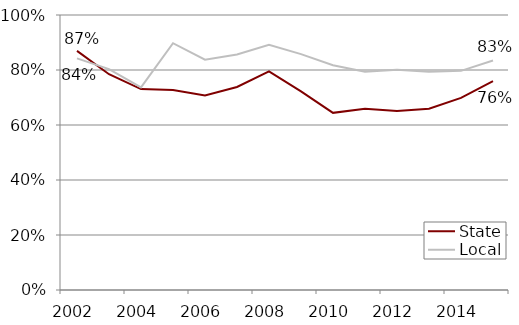
| Category | State | Local |
|---|---|---|
| 2002.0 | 0.87 | 0.842 |
| 2003.0 | 0.785 | 0.803 |
| 2004.0 | 0.731 | 0.737 |
| 2005.0 | 0.727 | 0.898 |
| 2006.0 | 0.707 | 0.838 |
| 2007.0 | 0.738 | 0.857 |
| 2008.0 | 0.795 | 0.892 |
| 2009.0 | 0.722 | 0.858 |
| 2010.0 | 0.644 | 0.817 |
| 2011.0 | 0.659 | 0.794 |
| 2012.0 | 0.651 | 0.801 |
| 2013.0 | 0.659 | 0.794 |
| 2014.0 | 0.699 | 0.797 |
| 2015.0 | 0.759 | 0.835 |